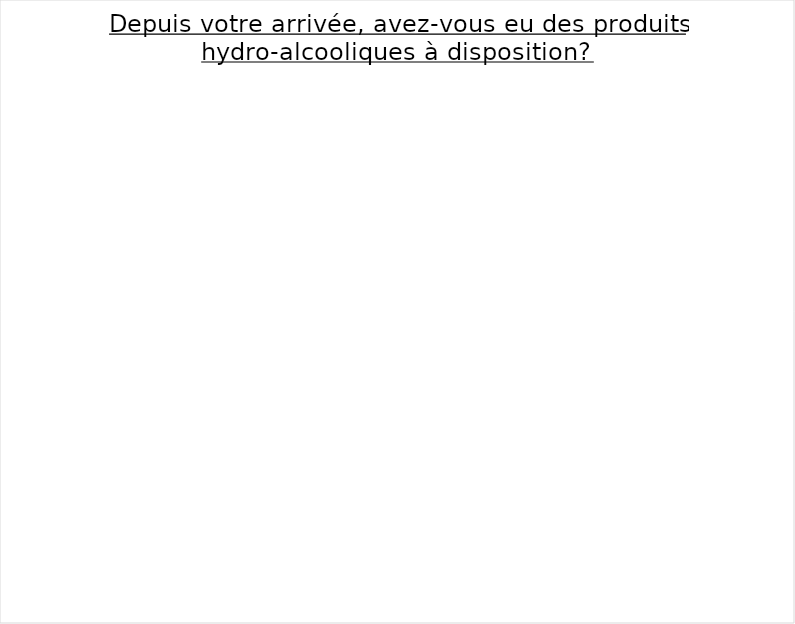
| Category | Series 0 |
|---|---|
| Non | 0 |
| Je ne me souviens pas  | 0 |
| Oui | 0 |